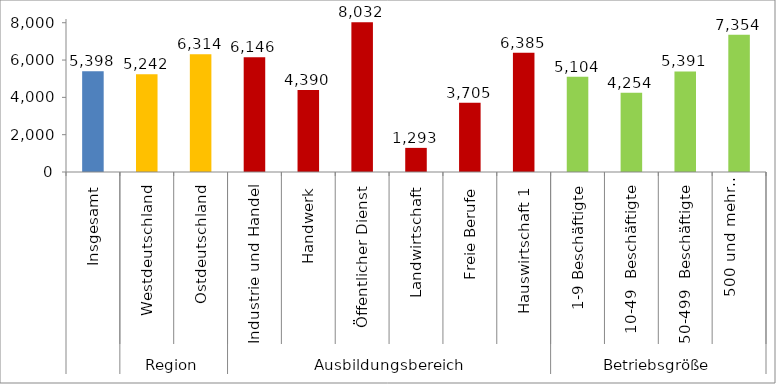
| Category | Nettokosten |
|---|---|
| 0 | 5397.971 |
| 1 | 5242.054 |
| 2 | 6313.939 |
| 3 | 6145.674 |
| 4 | 4389.831 |
| 5 | 8032.342 |
| 6 | 1292.54 |
| 7 | 3704.77 |
| 8 | 6384.56 |
| 9 | 5103.546 |
| 10 | 4253.887 |
| 11 | 5390.686 |
| 12 | 7353.679 |